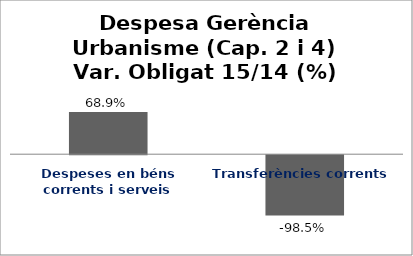
| Category | Series 0 |
|---|---|
| Despeses en béns corrents i serveis | 0.689 |
| Transferències corrents | -0.985 |